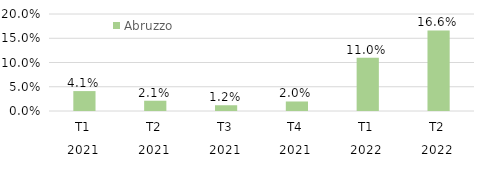
| Category | Abruzzo |
|---|---|
| 0 | 0.041 |
| 1 | 0.021 |
| 2 | 0.012 |
| 3 | 0.02 |
| 4 | 0.11 |
| 5 | 0.166 |